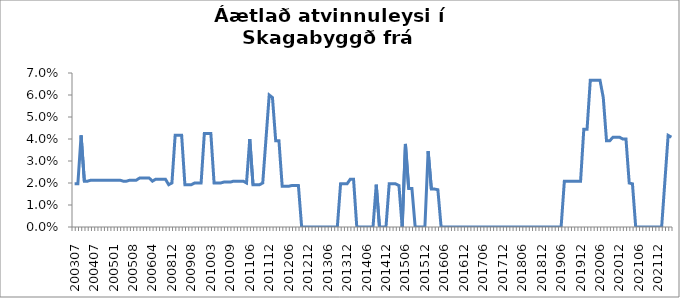
| Category | Series 0 |
|---|---|
| 200307 | 0.02 |
| 200309 | 0.02 |
| 200310 | 0.042 |
| 200311 | 0.021 |
| 200312 | 0.021 |
| 200402 | 0.021 |
| 200407 | 0.021 |
| 200408 | 0.021 |
| 200409 | 0.021 |
| 200410 | 0.021 |
| 200411 | 0.021 |
| 200412 | 0.021 |
| 200501 | 0.021 |
| 200502 | 0.021 |
| 200503 | 0.021 |
| 200505 | 0.021 |
| 200506 | 0.021 |
| 200507 | 0.021 |
| 200508 | 0.021 |
| 200509 | 0.021 |
| 200510 | 0.022 |
| 200511 | 0.022 |
| 200602 | 0.022 |
| 200603 | 0.022 |
| 200604 | 0.021 |
| 200610 | 0.022 |
| 200611 | 0.022 |
| 200701 | 0.022 |
| 200702 | 0.022 |
| 200703 | 0.019 |
| 200812 | 0.02 |
| 200901 | 0.042 |
| 200902 | 0.042 |
| 200903 | 0.042 |
| 200904 | 0.019 |
| 200907 | 0.019 |
| 200908 | 0.019 |
| 200910 | 0.02 |
| 200911 | 0.02 |
| 200912 | 0.02 |
| 201001 | 0.043 |
| 201002 | 0.043 |
| 201003 | 0.043 |
| 201004 | 0.02 |
| 201005 | 0.02 |
| 201006 | 0.02 |
| 201007 | 0.02 |
| 201008 | 0.02 |
| 201009 | 0.02 |
| 201010 | 0.021 |
| 201011 | 0.021 |
| 201012 | 0.021 |
| 201101 | 0.021 |
| 201105 | 0.02 |
| 201106 | 0.04 |
| 201107 | 0.019 |
| 201108 | 0.019 |
| 201109 | 0.019 |
| 201110 | 0.02 |
| 201111 | 0.04 |
| 201112 | 0.06 |
| 201201 | 0.059 |
| 201202 | 0.039 |
| 201203 | 0.039 |
| 201204 | 0.019 |
| 201205 | 0.019 |
| 201206 | 0.019 |
| 201207 | 0.019 |
| 201208 | 0.019 |
| 201209 | 0.019 |
| 201210 | 0 |
| 201211 | 0 |
| 201212 | 0 |
| 201301 | 0 |
| 201302 | 0 |
| 201303 | 0 |
| 201304 | 0 |
| 201305 | 0 |
| 201306 | 0 |
| 201307 | 0 |
| 201308 | 0 |
| 201309 | 0 |
| 201310 | 0.02 |
| 201311 | 0.02 |
| 201312 | 0.02 |
| 201401 | 0.022 |
| 201402 | 0.022 |
| 201403 | 0 |
| 201404 | 0 |
| 201405 | 0 |
| 201406 | 0 |
| 201407 | 0 |
| 201408 | 0 |
| 201409 | 0.019 |
| 201410 | 0 |
| 201411 | 0 |
| 201412 | 0 |
| 201501 | 0.02 |
| 201502 | 0.02 |
| 201503 | 0.02 |
| 201504 | 0.019 |
| 201505 | 0 |
| 201506 | 0.038 |
| 201507 | 0.018 |
| 201508 | 0.018 |
| 201509 | 0 |
| 201510 | 0 |
| 201511 | 0 |
| 201512 | 0 |
| 201601 | 0.034 |
| 201602 | 0.017 |
| 201603 | 0.017 |
| 201604 | 0.017 |
| 201605 | 0 |
| 201606 | 0 |
| 201607 | 0 |
| 201608 | 0 |
| 201609 | 0 |
| 201610 | 0 |
| 201611 | 0 |
| 201612 | 0 |
| 201701 | 0 |
| 201702 | 0 |
| 201703 | 0 |
| 201704 | 0 |
| 201705 | 0 |
| 201706 | 0 |
| 201707 | 0 |
| 201708 | 0 |
| 201709 | 0 |
| 201710 | 0 |
| 201711 | 0 |
| 201712 | 0 |
| 201801 | 0 |
| 201802 | 0 |
| 201803 | 0 |
| 201804 | 0 |
| 201805 | 0 |
| 201806 | 0 |
| 201807 | 0 |
| 201808 | 0 |
| 201809 | 0 |
| 201810 | 0 |
| 201811 | 0 |
| 201812 | 0 |
| 201901 | 0 |
| 201902 | 0 |
| 201903 | 0 |
| 201904 | 0 |
| 201905 | 0 |
| 201906 | 0 |
| 201907 | 0.021 |
| 201908 | 0.021 |
| 201909 | 0.021 |
| 201910 | 0.021 |
| 201911 | 0.021 |
| 201912 | 0.021 |
| 202001 | 0.044 |
| 202002 | 0.044 |
| 202003 | 0.067 |
| 202004 | 0.067 |
| 202005 | 0.067 |
| 202006 | 0.067 |
| 202007 | 0.059 |
| 202008 | 0.039 |
| 202009 | 0.039 |
| 202010 | 0.041 |
| 202011 | 0.041 |
| 202012 | 0.041 |
| 202101 | 0.04 |
| 202102 | 0.04 |
| 202103 | 0.02 |
| 202104 | 0.02 |
| 202105 | 0 |
| 202106 | 0 |
| 202107 | 0 |
| 202108 | 0 |
| 202109 | 0 |
| 202110 | 0 |
| 202111 | 0 |
| 202112 | 0 |
| 202201 | 0 |
| 202202 | 0.021 |
| 202203 | 0.042 |
| 202204 | 0.041 |